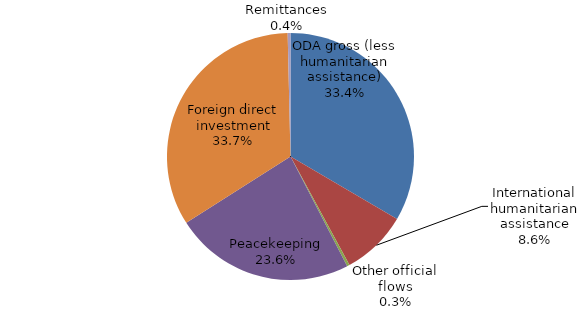
| Category | Series 0 |
|---|---|
| ODA gross (less humanitarian assistance) | 2050.455 |
| International humanitarian assistance | 529.233 |
| Other official flows | 20.64 |
| Peacekeeping | 1445.3 |
| Long-term debt (official) | 0 |
| Foreign direct investment | 2063.173 |
| Long-term debt (commercial) | 0 |
| Short-term debt | 0 |
| Net portfolio equity | 0 |
| Remittances | 22.378 |